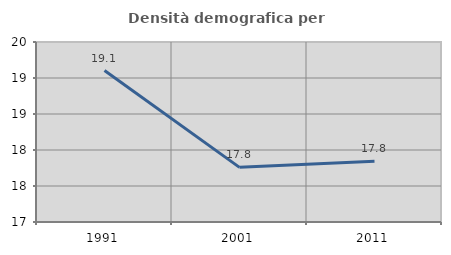
| Category | Densità demografica |
|---|---|
| 1991.0 | 19.103 |
| 2001.0 | 17.759 |
| 2011.0 | 17.843 |